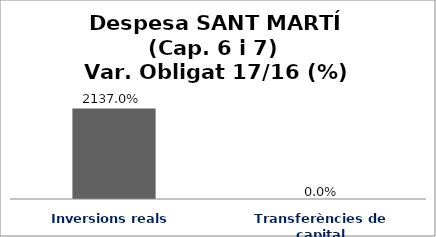
| Category | Series 0 |
|---|---|
| Inversions reals | 21.37 |
| Transferències de capital | 0 |